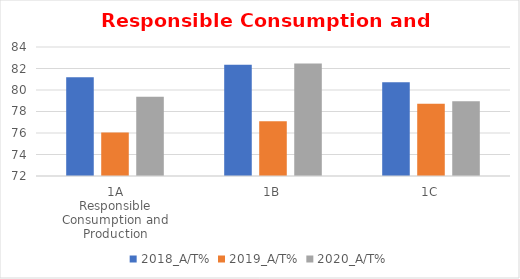
| Category | 2018_A/T% | 2019_A/T% | 2020_A/T% |
|---|---|---|---|
| 0 | 81.176 | 76.042 | 79.381 |
| 1 | 82.353 | 77.083 | 82.474 |
| 2 | 80.723 | 78.723 | 78.947 |